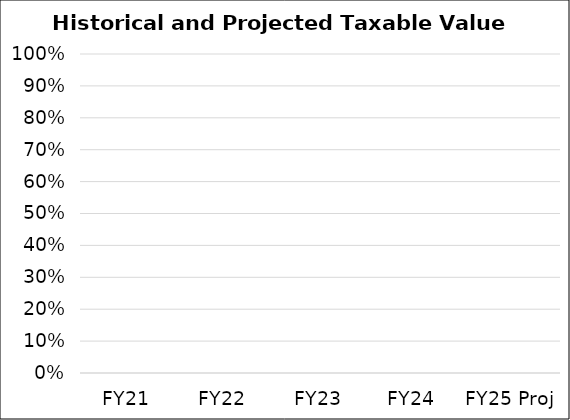
| Category | Series 0 |
|---|---|
| FY21 | 0 |
| FY22 | 0 |
| FY23 | 0 |
| FY24  | 0 |
| FY25 Proj | 0 |